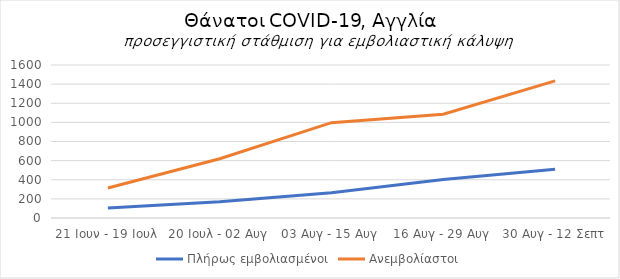
| Category | Πλήρως εμβολιασμένοι | Ανεμβολίαστοι |
|---|---|---|
| 21 Ιουν - 19 Ιουλ | 104 | 313.444 |
| 20 Ιουλ - 02 Αυγ | 169 | 619.75 |
| 03 Αυγ - 15 Αυγ | 263 | 997.262 |
| 16 Αυγ - 29 Αυγ | 402 | 1085.724 |
| 30 Αυγ - 12 Σεπτ | 511 | 1433.406 |